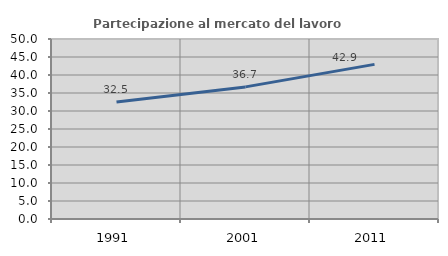
| Category | Partecipazione al mercato del lavoro  femminile |
|---|---|
| 1991.0 | 32.53 |
| 2001.0 | 36.697 |
| 2011.0 | 42.947 |